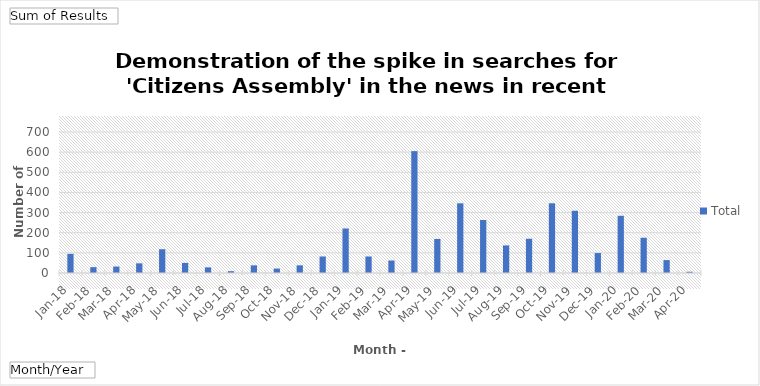
| Category | Total |
|---|---|
| Jan-18 | 95 |
| Feb-18 | 29 |
| Mar-18 | 32 |
| Apr-18 | 48 |
| May-18 | 118 |
| Jun-18 | 50 |
| Jul-18 | 28 |
| Aug-18 | 9 |
| Sep-18 | 38 |
| Oct-18 | 22 |
| Nov-18 | 38 |
| Dec-18 | 82 |
| Jan-19 | 221 |
| Feb-19 | 82 |
| Mar-19 | 62 |
| Apr-19 | 605 |
| May-19 | 169 |
| Jun-19 | 346 |
| Jul-19 | 263 |
| Aug-19 | 137 |
| Sep-19 | 170 |
| Oct-19 | 346 |
| Nov-19 | 309 |
| Dec-19 | 99 |
| Jan-20 | 284 |
| Feb-20 | 175 |
| Mar-20 | 64 |
| Apr-20 | 6 |